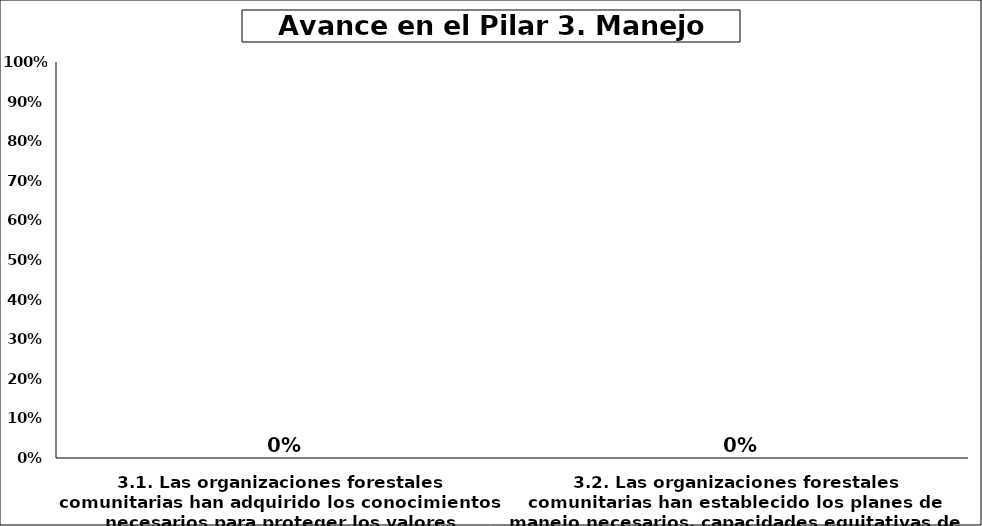
| Category | Series 6 |
|---|---|
| 3.1. Las organizaciones forestales comunitarias han adquirido los conocimientos necesarios para proteger los valores ambientales  | 0 |
| 3.2. Las organizaciones forestales comunitarias han establecido los planes de manejo necesarios, capacidades equitativas de género y relaciones para manejar el bosque de manera sostenible.  | 0 |